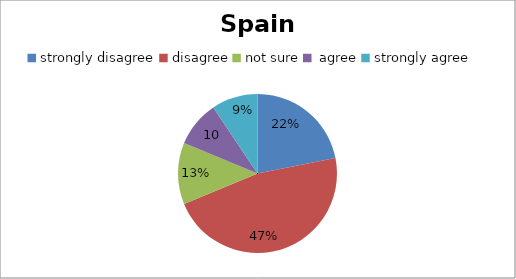
| Category | Spain |
|---|---|
| strongly disagree | 7 |
| disagree | 15 |
| not sure | 4 |
|  agree | 3 |
| strongly agree | 3 |